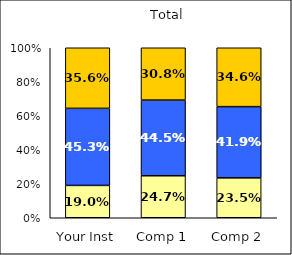
| Category | Low Institutional Priority: Civic Engagement | Average Institutional Priority: Civic Engagement | High Institutional Priority: Civic Engagement |
|---|---|---|---|
| Your Inst | 0.19 | 0.453 | 0.356 |
| Comp 1 | 0.247 | 0.445 | 0.308 |
| Comp 2 | 0.235 | 0.419 | 0.346 |